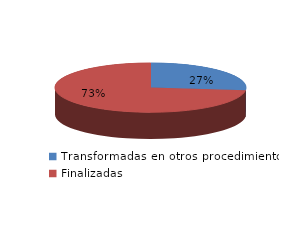
| Category | Series 0 |
|---|---|
| Transformadas en otros procedimientos | 1299 |
| Finalizadas | 3569 |